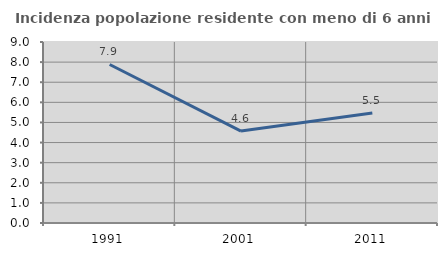
| Category | Incidenza popolazione residente con meno di 6 anni |
|---|---|
| 1991.0 | 7.883 |
| 2001.0 | 4.573 |
| 2011.0 | 5.472 |